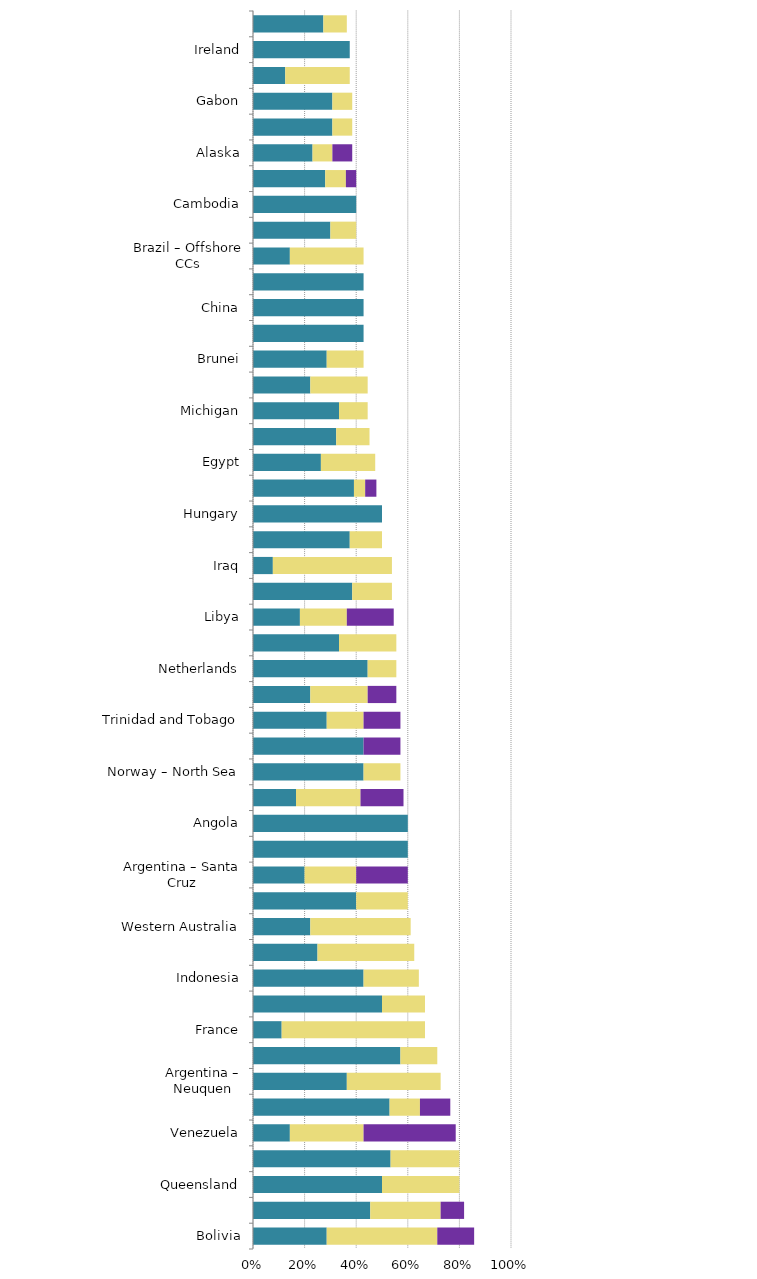
| Category | Mild deterrent to investment | Strong deterrent to investment | Would not pursue investment due to this factor |
|---|---|---|---|
| Bolivia | 0.286 | 0.429 | 0.143 |
| California | 0.455 | 0.273 | 0.091 |
| Queensland | 0.5 | 0.3 | 0 |
| Australia – Offshore | 0.533 | 0.267 | 0 |
| Venezuela | 0.143 | 0.286 | 0.357 |
| Mexico | 0.529 | 0.118 | 0.118 |
| Argentina – Neuquen | 0.364 | 0.364 | 0 |
| Victoria | 0.571 | 0.143 | 0 |
| France | 0.111 | 0.556 | 0 |
| Poland | 0.5 | 0.167 | 0 |
| Indonesia | 0.429 | 0.214 | 0 |
| Brazil – Offshore presalt PSCs | 0.25 | 0.375 | 0 |
| Western Australia | 0.222 | 0.389 | 0 |
| Argentina – Mendoza | 0.4 | 0.2 | 0 |
| Argentina – Santa Cruz | 0.2 | 0.2 | 0.2 |
| Bangladesh | 0.6 | 0 | 0 |
| Angola | 0.6 | 0 | 0 |
| Ecuador | 0.167 | 0.25 | 0.167 |
| Norway – North Sea | 0.429 | 0.143 | 0 |
| Kuwait | 0.429 | 0 | 0.143 |
| Trinidad and Tobago | 0.286 | 0.143 | 0.143 |
| Ohio | 0.222 | 0.222 | 0.111 |
| Netherlands | 0.444 | 0.111 | 0 |
| Romania | 0.333 | 0.222 | 0 |
| Libya | 0.182 | 0.182 | 0.182 |
| Algeria | 0.385 | 0.154 | 0 |
| Iraq | 0.077 | 0.462 | 0 |
| Northern Territory | 0.375 | 0.125 | 0 |
| Hungary | 0.5 | 0 | 0 |
| Nigeria | 0.391 | 0.043 | 0.043 |
| Egypt | 0.263 | 0.211 | 0 |
| British Columbia | 0.323 | 0.129 | 0 |
| Michigan | 0.333 | 0.111 | 0 |
| New South Wales | 0.222 | 0.222 | 0 |
| Brunei | 0.286 | 0.143 | 0 |
| Norway – Other Offshore (ex. Nth. Sea) | 0.429 | 0 | 0 |
| China | 0.429 | 0 | 0 |
| Oman | 0.429 | 0 | 0 |
| Brazil – Offshore CCs | 0.143 | 0.286 | 0 |
| Spain – Onshore | 0.3 | 0.1 | 0 |
| Cambodia | 0.4 | 0 | 0 |
| Colombia | 0.28 | 0.08 | 0.04 |
| Alaska | 0.231 | 0.077 | 0.077 |
| United Kingdom – North Sea | 0.308 | 0.077 | 0 |
| Gabon | 0.308 | 0.077 | 0 |
| Utah | 0.125 | 0.25 | 0 |
| Ireland | 0.375 | 0 | 0 |
| Pennsylvania | 0.273 | 0.091 | 0 |